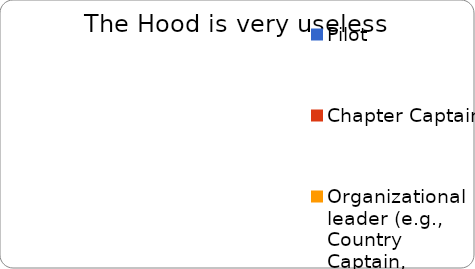
| Category | Very useless |
|---|---|
| Pilot | 0 |
| Chapter Captain | 0 |
| Organizational leader (e.g., Country Captain, member of The Hub) | 0 |